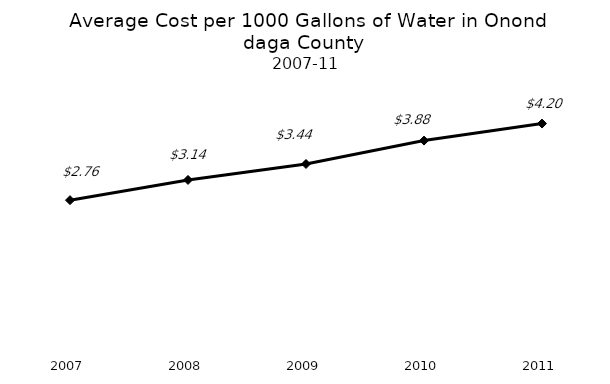
| Category | Cost |
|---|---|
| 2007.0 | 2.76 |
| 2008.0 | 3.14 |
| 2009.0 | 3.44 |
| 2010.0 | 3.88 |
| 2011.0 | 4.2 |